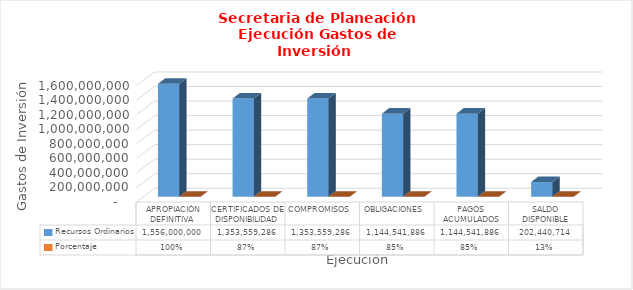
| Category | Recursos Ordinarios | Porcentaje |
|---|---|---|
| APROPIACIÓN DEFINITIVA  | 1556000000 | 1 |
| CERTIFICADOS DE DISPONIBILIDAD | 1353559286.23 | 0.87 |
| COMPROMISOS  | 1353559286.23 | 0.87 |
| OBLIGACIONES | 1144541886.23 | 0.846 |
| PAGOS ACUMULADOS | 1144541886.23 | 0.846 |
| SALDO DISPONIBLE | 202440713.77 | 0.13 |